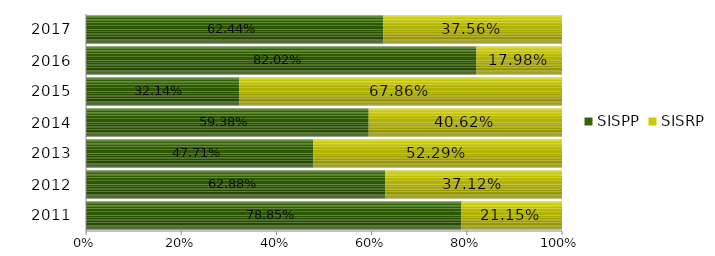
| Category | SISPP | SISRP |
|---|---|---|
| 2011.0 | 0.789 | 0.211 |
| 2012.0 | 0.629 | 0.371 |
| 2013.0 | 0.477 | 0.523 |
| 2014.0 | 0.594 | 0.406 |
| 2015.0 | 0.321 | 0.679 |
| 2016.0 | 0.82 | 0.18 |
| 2017.0 | 0.624 | 0.376 |